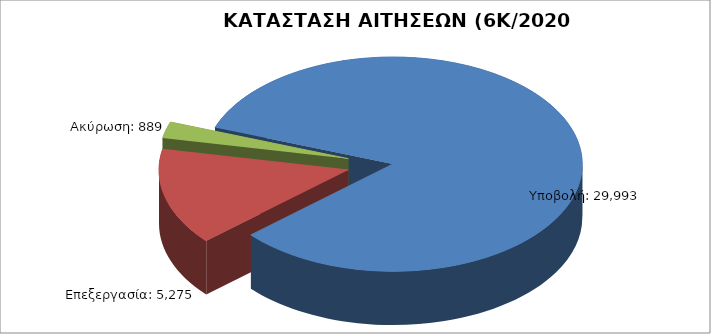
| Category | Series 0 |
|---|---|
| Υποβολή: | 29993 |
| Επεξεργασία: | 5275 |
| Ακύρωση: | 889 |